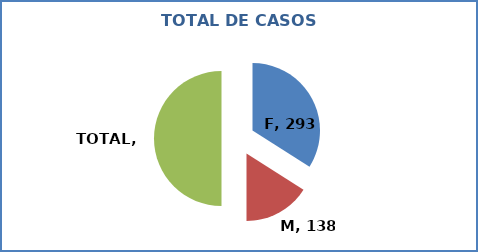
| Category | Series 0 |
|---|---|
| F | 293 |
| M | 138 |
| TOTAL | 431 |